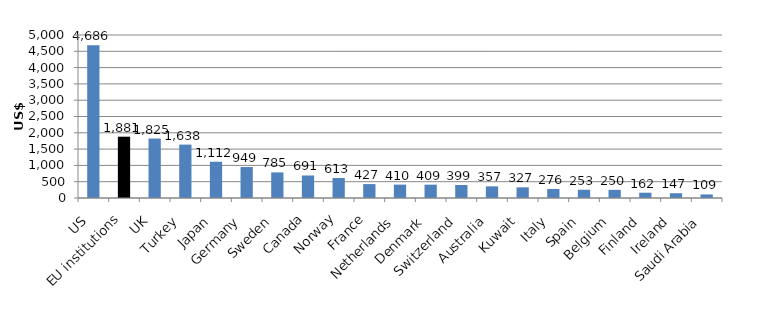
| Category | Series 0 |
|---|---|
| US | 4685.726 |
| EU institutions | 1880.521 |
| UK | 1824.668 |
| Turkey | 1637.62 |
| Japan | 1112.416 |
| Germany | 949.311 |
| Sweden | 785.161 |
| Canada | 690.663 |
| Norway | 613.356 |
| France | 426.69 |
| Netherlands | 410.288 |
| Denmark | 408.806 |
| Switzerland | 399.491 |
| Australia | 356.999 |
| Kuwait | 326.501 |
| Italy | 276.189 |
| Spain | 252.866 |
| Belgium | 249.707 |
| Finland | 162.066 |
| Ireland | 146.668 |
| Saudi Arabia | 109.132 |